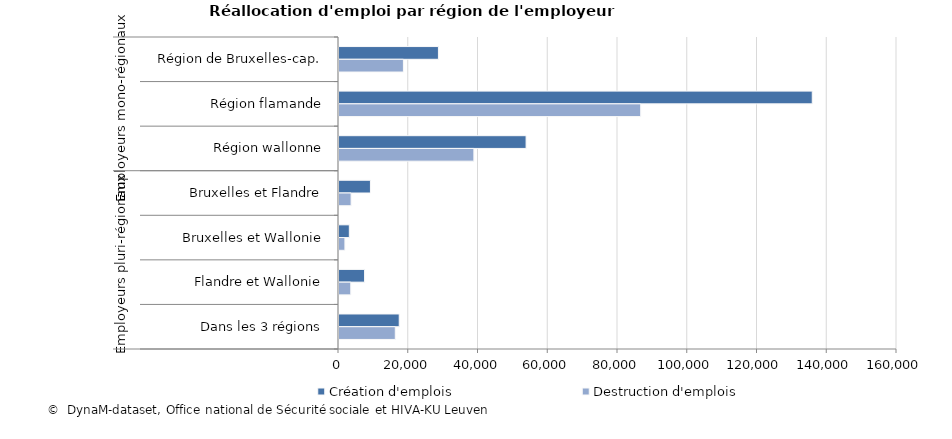
| Category | Création d'emplois | Destruction d'emplois |
|---|---|---|
| 0 | 28510 | 18468 |
| 1 | 135701 | 86513 |
| 2 | 53645 | 38678 |
| 3 | 9017 | 3470 |
| 4 | 2960 | 1697 |
| 5 | 7336 | 3378 |
| 6 | 17269 | 16140 |